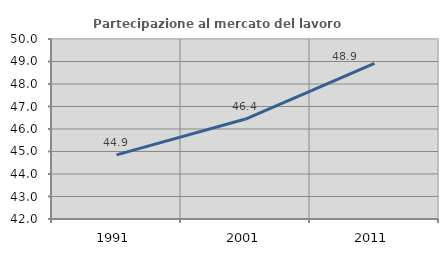
| Category | Partecipazione al mercato del lavoro  femminile |
|---|---|
| 1991.0 | 44.851 |
| 2001.0 | 46.444 |
| 2011.0 | 48.917 |